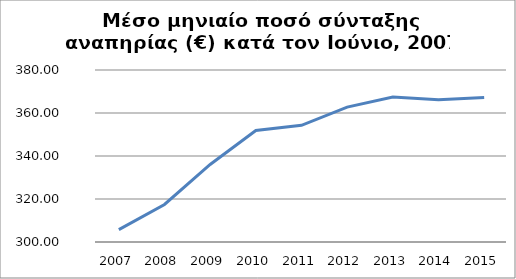
| Category | Series 0 |
|---|---|
| 2007.0 | 305.78 |
| 2008.0 | 317.45 |
| 2009.0 | 336.054 |
| 2010.0 | 351.834 |
| 2011.0 | 354.279 |
| 2012.0 | 362.726 |
| 2013.0 | 367.446 |
| 2014.0 | 366.129 |
| 2015.0 | 367.237 |